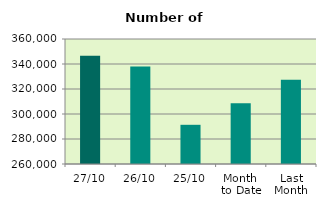
| Category | Series 0 |
|---|---|
| 27/10 | 346652 |
| 26/10 | 337976 |
| 25/10 | 291360 |
| Month 
to Date | 308565.684 |
| Last
Month | 327317.909 |